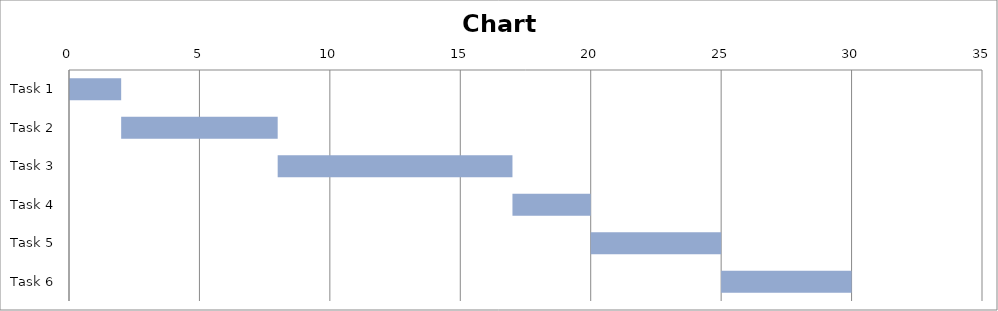
| Category | Start | Varaktighet |
|---|---|---|
| Task 1 | 0 | 2 |
| Task 2 | 2 | 6 |
| Task 3 | 8 | 9 |
| Task 4 | 17 | 3 |
| Task 5 | 20 | 5 |
| Task 6 | 25 | 5 |